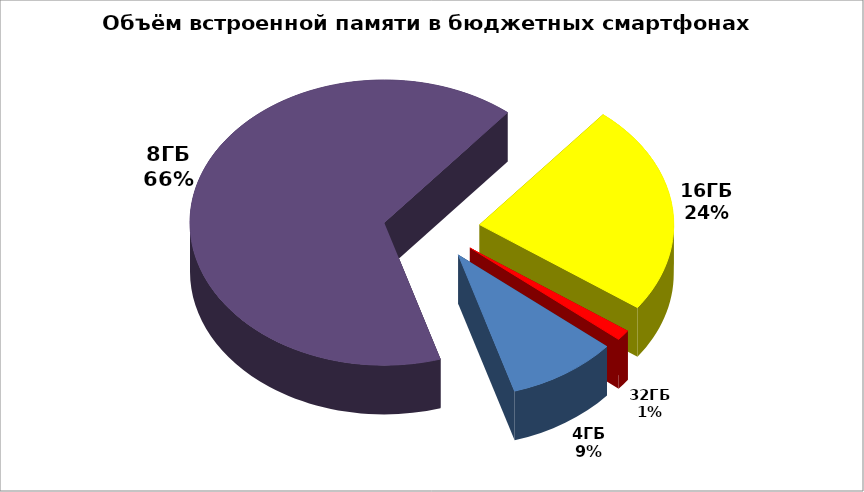
| Category | Series 0 |
|---|---|
| 4ГБ | 15 |
| 8ГБ | 107 |
| 16ГБ | 39 |
| 32ГБ | 2 |